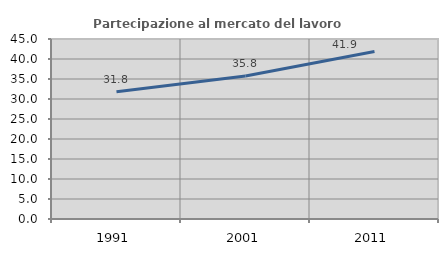
| Category | Partecipazione al mercato del lavoro  femminile |
|---|---|
| 1991.0 | 31.82 |
| 2001.0 | 35.752 |
| 2011.0 | 41.863 |